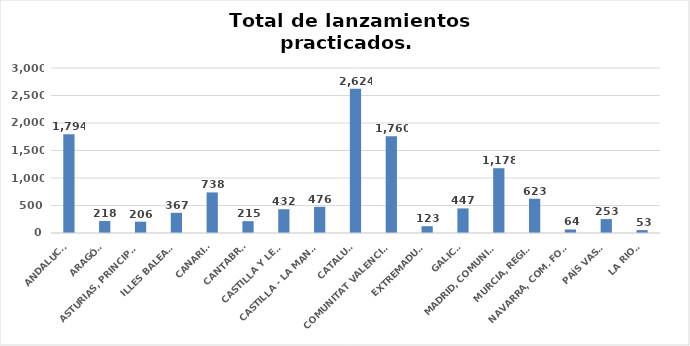
| Category | Series 0 |
|---|---|
| ANDALUCÍA | 1794 |
| ARAGÓN | 218 |
| ASTURIAS, PRINCIPADO | 206 |
| ILLES BALEARS | 367 |
| CANARIAS | 738 |
| CANTABRIA | 215 |
| CASTILLA Y LEÓN | 432 |
| CASTILLA - LA MANCHA | 476 |
| CATALUÑA | 2624 |
| COMUNITAT VALENCIANA | 1760 |
| EXTREMADURA | 123 |
| GALICIA | 447 |
| MADRID, COMUNIDAD | 1178 |
| MURCIA, REGIÓN | 623 |
| NAVARRA, COM. FORAL | 64 |
| PAÍS VASCO | 253 |
| LA RIOJA | 53 |